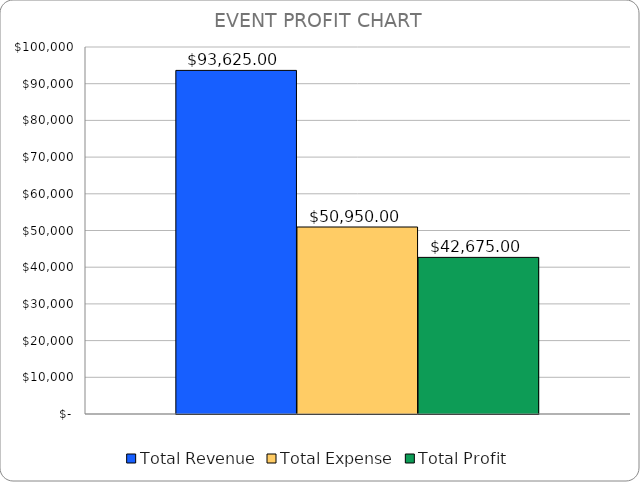
| Category | Total Revenue | Total Expense | Total Profit |
|---|---|---|---|
| TOTAL REVENUE | 93625 | 50950 | 42675 |